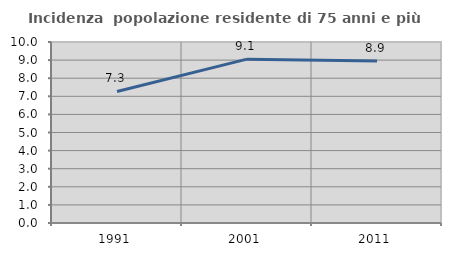
| Category | Incidenza  popolazione residente di 75 anni e più |
|---|---|
| 1991.0 | 7.266 |
| 2001.0 | 9.053 |
| 2011.0 | 8.945 |